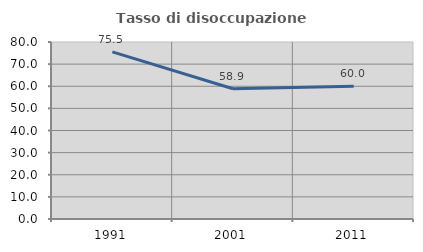
| Category | Tasso di disoccupazione giovanile  |
|---|---|
| 1991.0 | 75.532 |
| 2001.0 | 58.889 |
| 2011.0 | 60 |